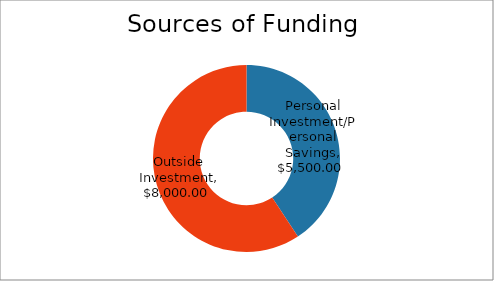
| Category | Sources of Funding |
|---|---|
| Personal Investment/Personal Savings | 5500 |
| Outside Investment | 8000 |
| Loans | 0 |